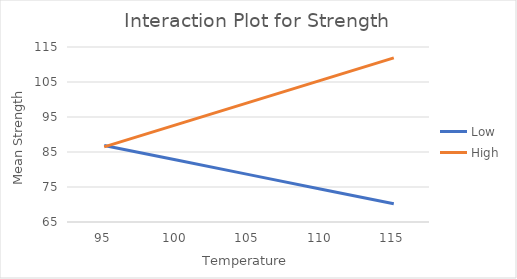
| Category | Low | High |
|---|---|---|
| 95.0 | 86.882 | 86.447 |
| 100.0 | 82.709 | 92.812 |
| 105.0 | 78.535 | 99.178 |
| 110.0 | 74.362 | 105.543 |
| 115.0 | 70.188 | 111.909 |